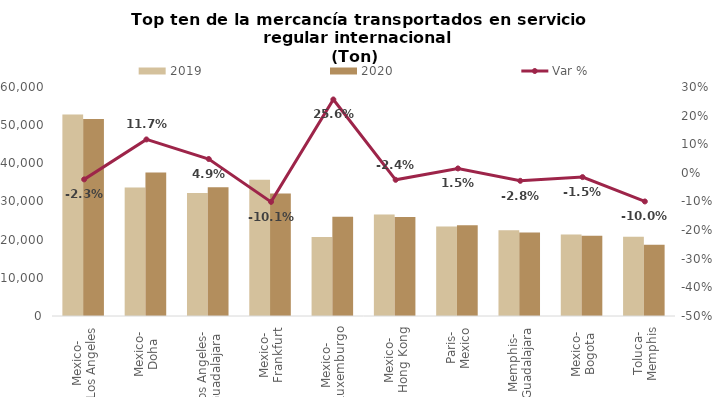
| Category | 2019 | 2020 |
|---|---|---|
| Mexico-
Los Angeles | 52806.766 | 51606.852 |
| Mexico-
Doha | 33681.827 | 37617.276 |
| Los Angeles-
Guadalajara | 32196.828 | 33758.434 |
| Mexico-
Frankfurt | 35694.536 | 32078.289 |
| Mexico-
Luxemburgo | 20692.228 | 25998.189 |
| Mexico-
Hong Kong | 26599.371 | 25954.917 |
| Paris-
Mexico | 23418.425 | 23780.974 |
| Memphis-
Guadalajara | 22483.471 | 21860.014 |
| Mexico-
Bogota | 21356.74 | 21041.309 |
| Toluca-
Memphis | 20764.524 | 18691.383 |